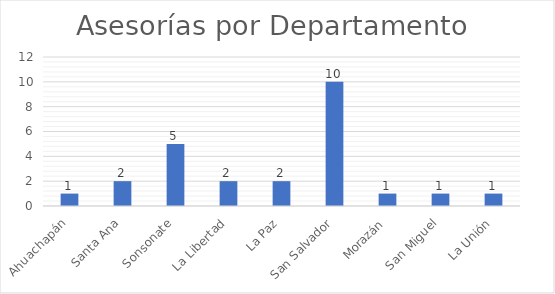
| Category | Asesorías |
|---|---|
| Ahuachapán | 1 |
| Santa Ana | 2 |
| Sonsonate | 5 |
| La Libertad | 2 |
| La Paz | 2 |
| San Salvador | 10 |
| Morazán | 1 |
| San Miguel | 1 |
| La Unión | 1 |